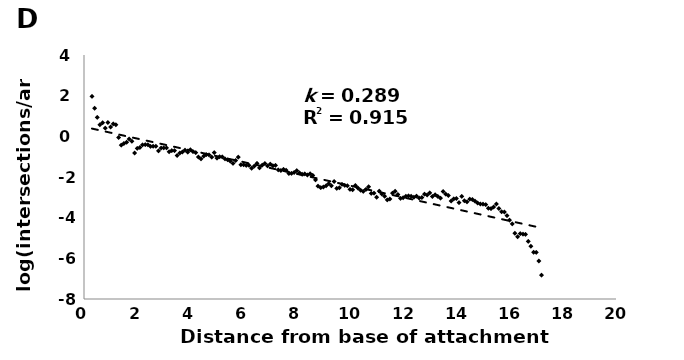
| Category | Series 0 |
|---|---|
| 0.3 | 1.96 |
| 0.4 | 1.38 |
| 0.5 | 0.93 |
| 0.6 | 0.57 |
| 0.7 | 0.67 |
| 0.8 | 0.4 |
| 0.9 | 0.68 |
| 1.0 | 0.46 |
| 1.1 | 0.61 |
| 1.2 | 0.57 |
| 1.3 | -0.06 |
| 1.4 | -0.43 |
| 1.5 | -0.35 |
| 1.6 | -0.29 |
| 1.7 | -0.13 |
| 1.8 | -0.24 |
| 1.9 | -0.82 |
| 2.0 | -0.59 |
| 2.1 | -0.55 |
| 2.2 | -0.42 |
| 2.3 | -0.41 |
| 2.4 | -0.41 |
| 2.5 | -0.49 |
| 2.6 | -0.49 |
| 2.7 | -0.49 |
| 2.8 | -0.72 |
| 2.9 | -0.57 |
| 3.0 | -0.57 |
| 3.1 | -0.57 |
| 3.2 | -0.76 |
| 3.3 | -0.7 |
| 3.4 | -0.7 |
| 3.5 | -0.94 |
| 3.6 | -0.82 |
| 3.7 | -0.77 |
| 3.8 | -0.68 |
| 3.9 | -0.78 |
| 4.0 | -0.66 |
| 4.1 | -0.75 |
| 4.2 | -0.8 |
| 4.3 | -1.02 |
| 4.4 | -1.11 |
| 4.5 | -0.97 |
| 4.6 | -0.9 |
| 4.7 | -0.91 |
| 4.8 | -1.02 |
| 4.9 | -0.8 |
| 5.0 | -1.07 |
| 5.1 | -1 |
| 5.2 | -1.01 |
| 5.3 | -1.11 |
| 5.4 | -1.15 |
| 5.5 | -1.22 |
| 5.6 | -1.33 |
| 5.7 | -1.19 |
| 5.8 | -1.02 |
| 5.9 | -1.4 |
| 6.0 | -1.4 |
| 6.1 | -1.43 |
| 6.2 | -1.43 |
| 6.3 | -1.57 |
| 6.4 | -1.46 |
| 6.5 | -1.33 |
| 6.6 | -1.55 |
| 6.7 | -1.42 |
| 6.8 | -1.34 |
| 6.9 | -1.45 |
| 7.0 | -1.37 |
| 7.1 | -1.45 |
| 7.2 | -1.43 |
| 7.3 | -1.65 |
| 7.4 | -1.68 |
| 7.5 | -1.62 |
| 7.6 | -1.67 |
| 7.7 | -1.83 |
| 7.8 | -1.82 |
| 7.9 | -1.78 |
| 8.0 | -1.69 |
| 8.1 | -1.8 |
| 8.2 | -1.86 |
| 8.3 | -1.85 |
| 8.4 | -1.9 |
| 8.5 | -1.84 |
| 8.6 | -1.92 |
| 8.7 | -2.14 |
| 8.8 | -2.45 |
| 8.9 | -2.52 |
| 9.0 | -2.49 |
| 9.1 | -2.43 |
| 9.2 | -2.33 |
| 9.3 | -2.43 |
| 9.4 | -2.22 |
| 9.5 | -2.56 |
| 9.6 | -2.53 |
| 9.7 | -2.36 |
| 9.8 | -2.41 |
| 9.9 | -2.43 |
| 10.0 | -2.61 |
| 10.1 | -2.63 |
| 10.2 | -2.42 |
| 10.3 | -2.55 |
| 10.4 | -2.65 |
| 10.5 | -2.71 |
| 10.6 | -2.61 |
| 10.7 | -2.48 |
| 10.8 | -2.81 |
| 10.9 | -2.79 |
| 11.0 | -3 |
| 11.1 | -2.7 |
| 11.2 | -2.84 |
| 11.3 | -2.95 |
| 11.4 | -3.12 |
| 11.5 | -3.08 |
| 11.6 | -2.79 |
| 11.7 | -2.7 |
| 11.8 | -2.86 |
| 11.9 | -3.05 |
| 12.0 | -3.02 |
| 12.1 | -2.95 |
| 12.2 | -2.93 |
| 12.3 | -2.95 |
| 12.4 | -3 |
| 12.5 | -2.94 |
| 12.6 | -3.03 |
| 12.7 | -3.01 |
| 12.8 | -2.84 |
| 12.9 | -2.89 |
| 13.0 | -2.78 |
| 13.1 | -2.96 |
| 13.2 | -2.87 |
| 13.3 | -2.95 |
| 13.4 | -3.04 |
| 13.5 | -2.71 |
| 13.6 | -2.84 |
| 13.7 | -2.91 |
| 13.8 | -3.18 |
| 13.9 | -3.08 |
| 14.0 | -3.06 |
| 14.1 | -3.26 |
| 14.2 | -2.95 |
| 14.3 | -3.17 |
| 14.4 | -3.22 |
| 14.5 | -3.09 |
| 14.6 | -3.11 |
| 14.7 | -3.19 |
| 14.8 | -3.28 |
| 14.9 | -3.33 |
| 15.0 | -3.34 |
| 15.1 | -3.36 |
| 15.2 | -3.54 |
| 15.3 | -3.56 |
| 15.4 | -3.48 |
| 15.5 | -3.33 |
| 15.6 | -3.55 |
| 15.7 | -3.71 |
| 15.8 | -3.72 |
| 15.9 | -3.9 |
| 16.0 | -4.12 |
| 16.1 | -4.3 |
| 16.2 | -4.77 |
| 16.3 | -4.94 |
| 16.4 | -4.79 |
| 16.5 | -4.81 |
| 16.6 | -4.82 |
| 16.7 | -5.17 |
| 16.8 | -5.4 |
| 16.9 | -5.7 |
| 17.0 | -5.71 |
| 17.1 | -6.13 |
| 17.2 | -6.83 |